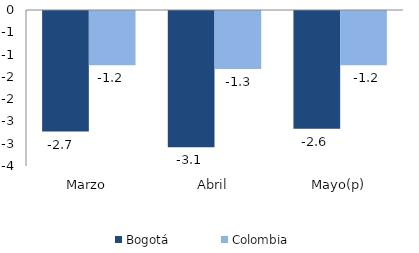
| Category | Bogotá | Colombia |
|---|---|---|
| Marzo | -2.705 | -1.218 |
| Abril | -3.055 | -1.301 |
| Mayo(p) | -2.642 | -1.217 |